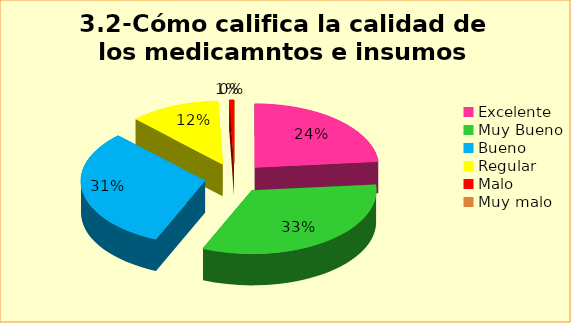
| Category | Series 0 |
|---|---|
| Excelente | 0.235 |
| Muy Bueno | 0.329 |
| Bueno  | 0.312 |
| Regular  | 0.118 |
| Malo  | 0.006 |
| Muy malo  | 0 |